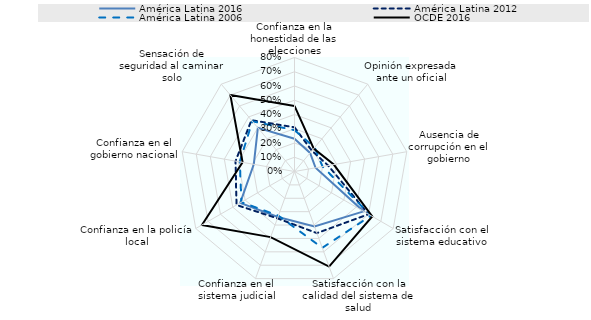
| Category | América Latina 2016 | América Latina 2012 | América Latina 2006  | OCDE 2016 |
|---|---|---|---|---|
| Confianza en la honestidad de las elecciones | 0.23 | 0.31 | 0.29 | 0.46 |
| Opinión expresada ante un oficial | 0.17 | 0.19 | 0.22 | 0.21 |
| Ausencia de corrupción en el gobierno | 0.15 | 0.24 | 0.2 | 0.28 |
| Satisfacción con el sistema educativo | 0.56 | 0.6 | 0.62 | 0.63 |
| Satisfacción con la calidad del sistema de salud | 0.41 | 0.46 | 0.57 | 0.71 |
| Confianza en el sistema judicial | 0.34 | 0.35 | 0.33 | 0.49 |
| Confianza en la policía local | 0.44 | 0.47 | 0.43 | 0.75 |
| Confianza en el gobierno nacional | 0.29 | 0.42 | 0.39 | 0.37 |
| Sensación de seguridad al caminar solo | 0.4 | 0.47 | 0.46 | 0.7 |